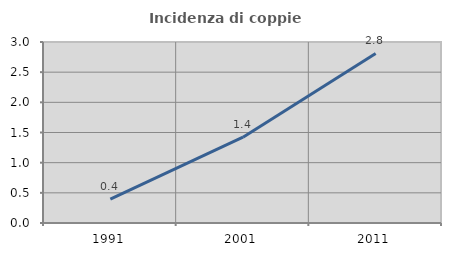
| Category | Incidenza di coppie miste |
|---|---|
| 1991.0 | 0.397 |
| 2001.0 | 1.422 |
| 2011.0 | 2.809 |